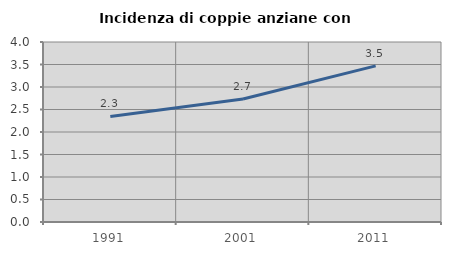
| Category | Incidenza di coppie anziane con figli |
|---|---|
| 1991.0 | 2.345 |
| 2001.0 | 2.734 |
| 2011.0 | 3.47 |